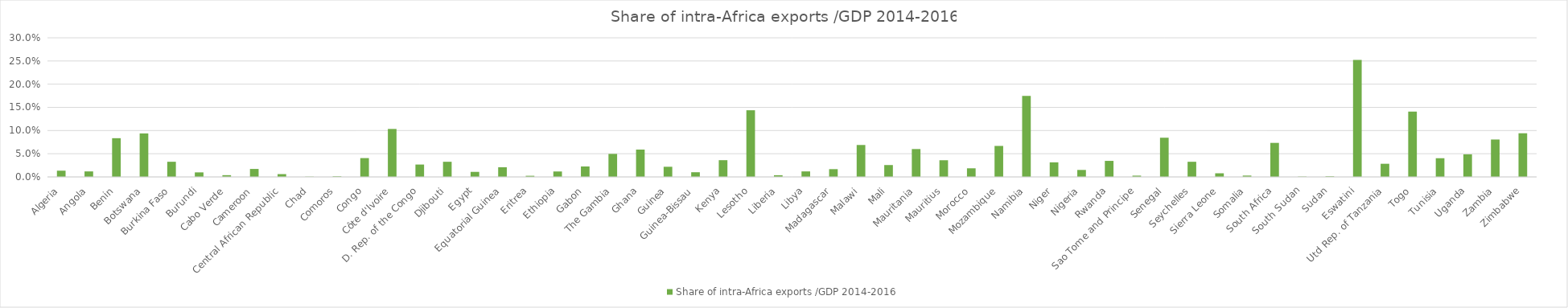
| Category | Share of intra-Africa exports /GDP 2014-2016 |
|---|---|
| Algeria | 0.013 |
| Angola | 0.012 |
| Benin | 0.084 |
| Botswana | 0.094 |
| Burkina Faso | 0.033 |
| Burundi | 0.01 |
| Cabo Verde | 0.004 |
| Cameroon | 0.017 |
| Central African Republic | 0.006 |
| Chad | 0.001 |
| Comoros | 0.001 |
| Congo | 0.041 |
| Côte d'Ivoire | 0.103 |
| D. Rep. of the Congo | 0.027 |
| Djibouti | 0.033 |
| Egypt | 0.011 |
| Equatorial Guinea | 0.021 |
| Eritrea | 0.002 |
| Ethiopia | 0.012 |
| Gabon | 0.023 |
| The Gambia | 0.05 |
| Ghana | 0.059 |
| Guinea | 0.022 |
| Guinea-Bissau | 0.01 |
| Kenya | 0.036 |
| Lesotho | 0.144 |
| Liberia | 0.004 |
| Libya | 0.012 |
| Madagascar | 0.017 |
| Malawi | 0.069 |
| Mali | 0.026 |
| Mauritania | 0.06 |
| Mauritius | 0.036 |
| Morocco | 0.019 |
| Mozambique | 0.067 |
| Namibia | 0.175 |
| Niger | 0.031 |
| Nigeria | 0.015 |
| Rwanda | 0.035 |
| Sao Tome and Principe | 0.003 |
| Senegal | 0.085 |
| Seychelles | 0.033 |
| Sierra Leone | 0.008 |
| Somalia | 0.003 |
| South Africa | 0.073 |
| South Sudan | 0.001 |
| Sudan | 0.001 |
| Eswatini | 0.253 |
| Utd Rep. of Tanzania | 0.028 |
| Togo | 0.141 |
| Tunisia | 0.04 |
| Uganda | 0.049 |
| Zambia | 0.081 |
| Zimbabwe | 0.094 |